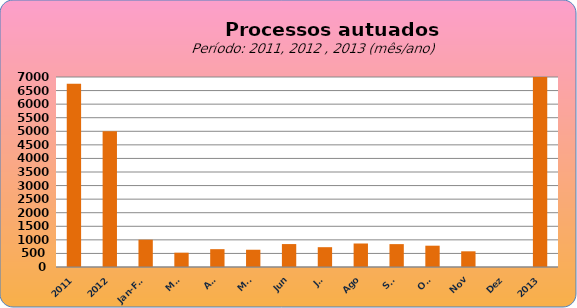
| Category | 6749 4998 1006 527 657 636 845 730 866 843 785 578 0 |
|---|---|
| 2011 | 6749 |
| 2012 | 4998 |
| Jan-Fev | 1006 |
| Mar | 527 |
| Abr | 657 |
| Mai | 636 |
| Jun | 845 |
| Jul | 730 |
| Ago | 866 |
| Set | 843 |
| Out | 785 |
| Nov | 578 |
| Dez | 0 |
| 2013 | 7473 |